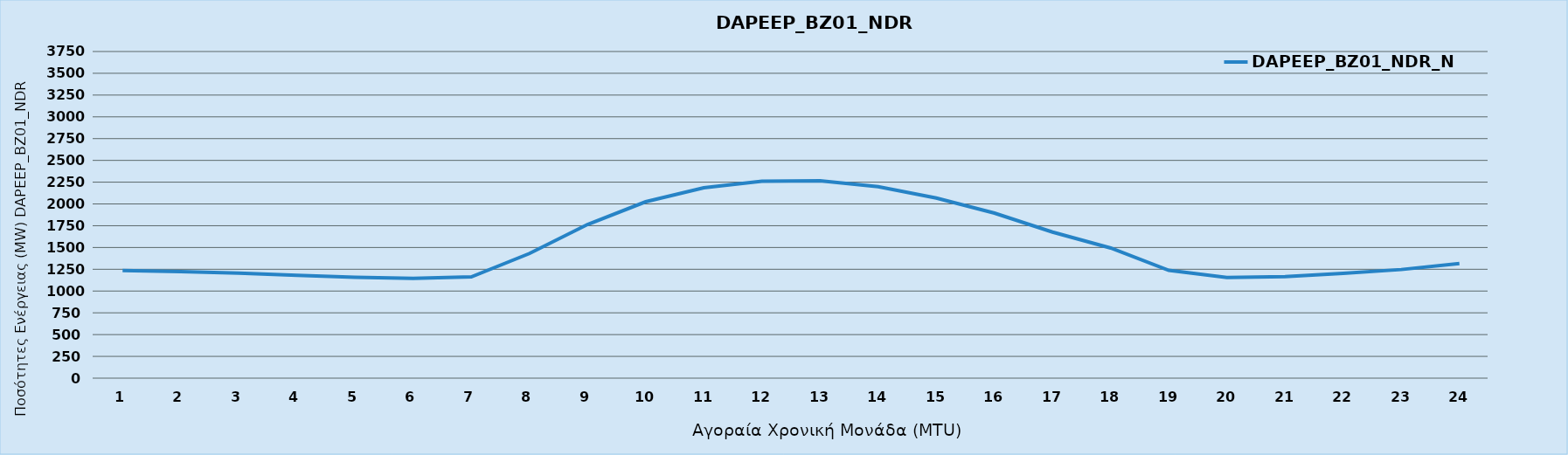
| Category | DAPEEP_BZ01_NDR_N1 |
|---|---|
| 0 | 1235 |
| 1 | 1222 |
| 2 | 1205 |
| 3 | 1181 |
| 4 | 1158 |
| 5 | 1146 |
| 6 | 1162 |
| 7 | 1431 |
| 8 | 1764 |
| 9 | 2025 |
| 10 | 2185 |
| 11 | 2261 |
| 12 | 2267 |
| 13 | 2198 |
| 14 | 2068 |
| 15 | 1895 |
| 16 | 1677 |
| 17 | 1494 |
| 18 | 1238 |
| 19 | 1156 |
| 20 | 1165 |
| 21 | 1204 |
| 22 | 1247 |
| 23 | 1315 |